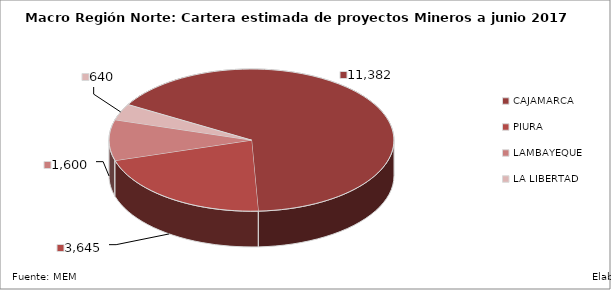
| Category | Series 0 |
|---|---|
| CAJAMARCA | 11382 |
| PIURA | 3645 |
| LAMBAYEQUE | 1600 |
| LA LIBERTAD | 640 |